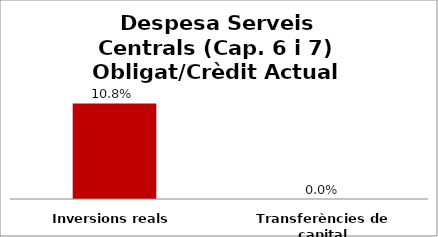
| Category | Series 0 |
|---|---|
| Inversions reals | 0.108 |
| Transferències de capital | 0 |